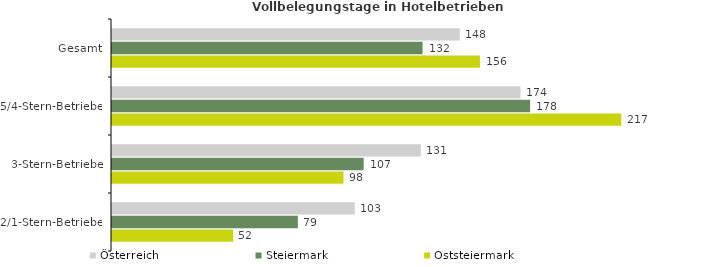
| Category | Österreich | Steiermark | Oststeiermark |
|---|---|---|---|
| Gesamt | 147.876 | 132.038 | 156.441 |
| 5/4-Stern-Betriebe | 173.697 | 177.779 | 216.521 |
| 3-Stern-Betriebe | 131.294 | 107.011 | 98.437 |
| 2/1-Stern-Betriebe | 103.222 | 79.024 | 51.541 |